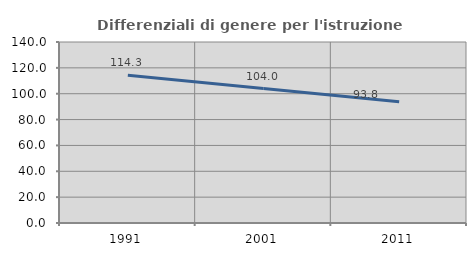
| Category | Differenziali di genere per l'istruzione superiore |
|---|---|
| 1991.0 | 114.341 |
| 2001.0 | 103.969 |
| 2011.0 | 93.762 |